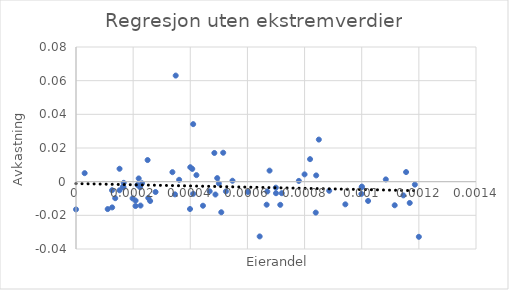
| Category | Summer av alfa |
|---|---|
| 0.0012 | -0.033 |
| 0.001186020139019977 | -0.002 |
| 0.0011680213442347104 | -0.013 |
| 0.0011553190869533444 | 0.006 |
| 0.0011458478338760992 | -0.008 |
| 0.0011154443757192289 | -0.014 |
| 0.0010843163189620288 | 0.001 |
| 0.0010223319461726752 | -0.011 |
| 0.0010006183918867902 | -0.003 |
| 0.0009999908251586977 | -0.003 |
| 0.0009988300305536235 | -0.007 |
| 0.0009427044041259418 | -0.013 |
| 0.0008861980235444139 | -0.005 |
| 0.0008499078682596311 | 0.025 |
| 0.000840726804417122 | 0.004 |
| 0.0008390870070072087 | -0.018 |
| 0.0008191903449479407 | 0.013 |
| 0.0008 | 0.004 |
| 0.0007799970978285392 | 0 |
| 0.00072015186675707 | -0.007 |
| 0.0007149598565675485 | -0.014 |
| 0.0007 | -0.007 |
| 0.000699357659883844 | -0.004 |
| 0.0006774924185142361 | 0.007 |
| 0.0006695918020169416 | -0.006 |
| 0.0006672693960784447 | -0.014 |
| 0.0006428551134384107 | -0.033 |
| 0.0006018495806229883 | -0.006 |
| 0.0005476785940811693 | 0.001 |
| 0.0005247466455924037 | -0.006 |
| 0.0005152007740349949 | 0.017 |
| 0.0005084635570901136 | -0.018 |
| 0.0005 | -0.001 |
| 0.0004942704226655578 | 0.002 |
| 0.0004880685234893642 | -0.008 |
| 0.0004842428578682265 | 0.017 |
| 0.00046785156207055235 | -0.006 |
| 0.0004443807727332833 | -0.014 |
| 0.00042150122363745525 | 0.004 |
| 0.00041008365977458837 | 0.034 |
| 0.00041008365977458837 | -0.007 |
| 0.00040691446519699115 | 0.008 |
| 0.0004 | 0.009 |
| 0.0003990322715591934 | -0.016 |
| 0.0003609831443199048 | 0.001 |
| 0.0003489786288085406 | 0.063 |
| 0.00034641073943863295 | -0.008 |
| 0.0003374569664220461 | 0.006 |
| 0.00027844682435660583 | -0.006 |
| 0.0002595313500263658 | -0.011 |
| 0.00025298676391990115 | -0.01 |
| 0.00025064852215895194 | 0.013 |
| 0.00023115298681709233 | -0.001 |
| 0.0002259066787112356 | -0.014 |
| 0.0002243079874956221 | -0.003 |
| 0.00021945210655072655 | 0.002 |
| 0.0002150097562035386 | -0.002 |
| 0.00020851698518656965 | -0.011 |
| 0.00020837098023288898 | -0.014 |
| 0.0001980452650267387 | -0.01 |
| 0.00016696260084055116 | -0.001 |
| 0.00016642098091662047 | -0.003 |
| 0.00016414944962567013 | -0.003 |
| 0.00015238989812994718 | 0.008 |
| 0.0001523884416425563 | -0.005 |
| 0.00013728016980114066 | -0.01 |
| 0.0001265607998158437 | -0.015 |
| 0.00012615069855855925 | -0.005 |
| 0.00011097748891312593 | -0.016 |
| 3.027877476889338e-05 | 0.005 |
| 0.0 | -0.016 |